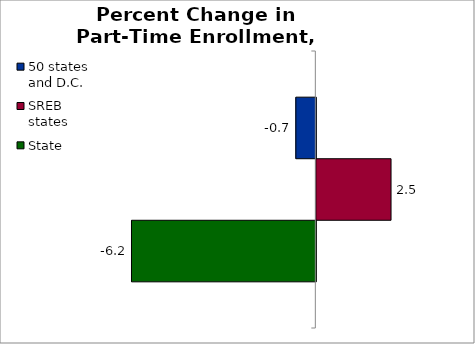
| Category | 50 states and D.C. | SREB states | State |
|---|---|---|---|
| 0 | -0.669 | 2.497 | -6.162 |